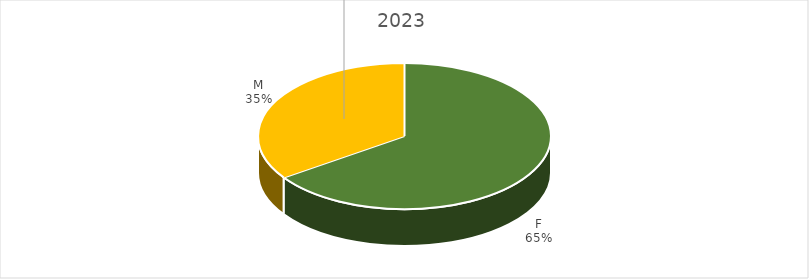
| Category | Series 0 |
|---|---|
| F | 0.654 |
| M | 0.346 |